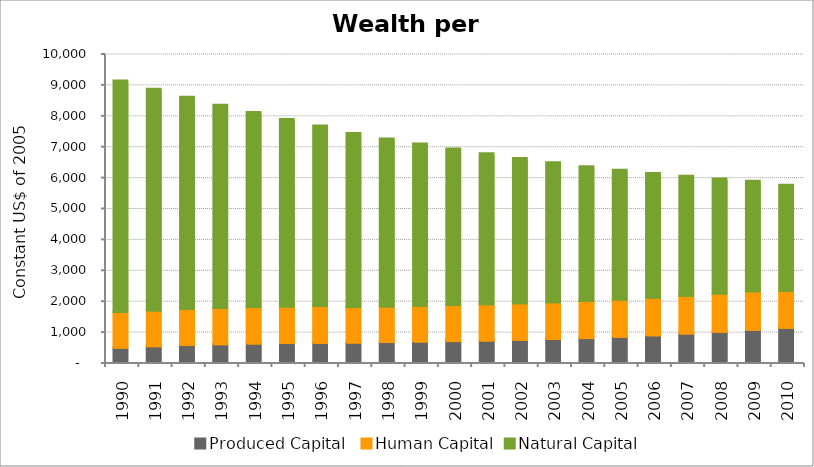
| Category | Produced Capital  | Human Capital | Natural Capital |
|---|---|---|---|
| 1990.0 | 464.005 | 1153.072 | 7474.144 |
| 1991.0 | 510.955 | 1157.565 | 7161.333 |
| 1992.0 | 550.459 | 1163.337 | 6856.425 |
| 1993.0 | 576.633 | 1169.853 | 6565.67 |
| 1994.0 | 600.227 | 1176.725 | 6295.492 |
| 1995.0 | 612.15 | 1183.747 | 6048.293 |
| 1996.0 | 621.699 | 1190.303 | 5822.769 |
| 1997.0 | 630.733 | 1146.358 | 5614.575 |
| 1998.0 | 644.824 | 1153.641 | 5418.964 |
| 1999.0 | 660.273 | 1160.988 | 5230.776 |
| 2000.0 | 675.928 | 1167.935 | 5046.754 |
| 2001.0 | 695.433 | 1174.942 | 4866.124 |
| 2002.0 | 716.736 | 1183.054 | 4689.58 |
| 2003.0 | 743.935 | 1191.001 | 4516.876 |
| 2004.0 | 774.512 | 1198.771 | 4347.977 |
| 2005.0 | 815.037 | 1206.252 | 4182.876 |
| 2006.0 | 864.182 | 1215.469 | 4022.038 |
| 2007.0 | 921.518 | 1224.96 | 3864.868 |
| 2008.0 | 979.578 | 1234.974 | 3711.393 |
| 2009.0 | 1041.455 | 1245.265 | 3561.668 |
| 2010.0 | 1105.279 | 1200.027 | 3415.816 |